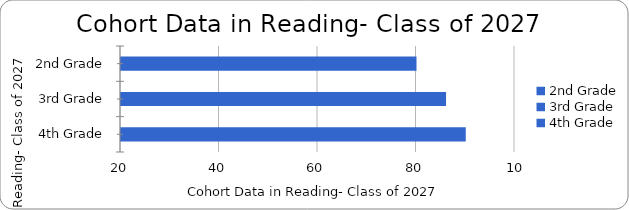
| Category | Cohort Data in Reading- Class of 2027 |
|---|---|
| 2nd Grade | 80 |
| 3rd Grade | 86 |
| 4th Grade | 90 |